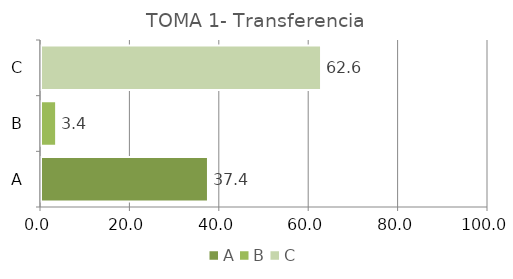
| Category | Series 0 |
|---|---|
| A | 37.353 |
| B | 3.382 |
| C | 62.647 |